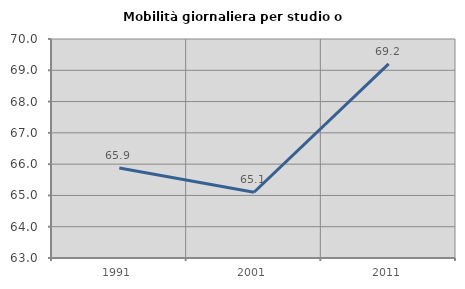
| Category | Mobilità giornaliera per studio o lavoro |
|---|---|
| 1991.0 | 65.876 |
| 2001.0 | 65.101 |
| 2011.0 | 69.205 |